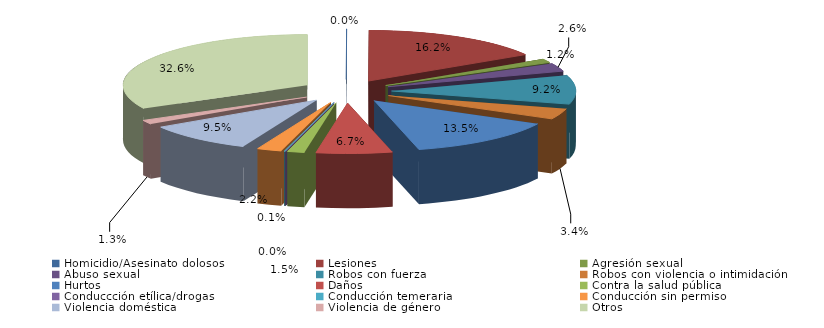
| Category | Series 0 |
|---|---|
| Homicidio/Asesinato dolosos | 1 |
| Lesiones | 367 |
| Agresión sexual | 27 |
| Abuso sexual | 58 |
| Robos con fuerza | 209 |
| Robos con violencia o intimidación | 78 |
| Hurtos | 305 |
| Daños | 151 |
| Contra la salud pública | 34 |
| Conduccción etílica/drogas | 0 |
| Conducción temeraria | 2 |
| Conducción sin permiso | 49 |
| Violencia doméstica | 216 |
| Violencia de género | 30 |
| Otros | 740 |